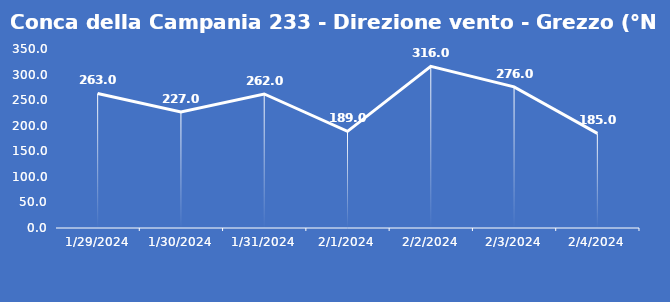
| Category | Conca della Campania 233 - Direzione vento - Grezzo (°N) |
|---|---|
| 1/29/24 | 263 |
| 1/30/24 | 227 |
| 1/31/24 | 262 |
| 2/1/24 | 189 |
| 2/2/24 | 316 |
| 2/3/24 | 276 |
| 2/4/24 | 185 |